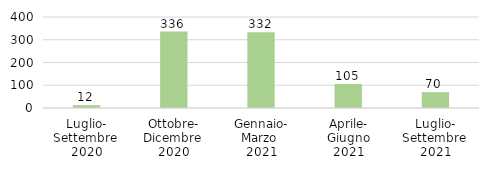
| Category | Abruzzo |
|---|---|
| Luglio-
Settembre 
2020 | 12.304 |
| Ottobre-
Dicembre 
2020 | 335.815 |
| Gennaio-
Marzo 
2021 | 332.478 |
| Aprile-
Giugno
2021 | 105.385 |
| Luglio-
Settembre 
2021 | 69.533 |